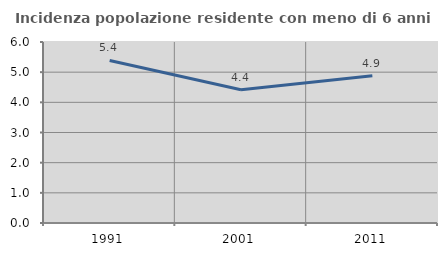
| Category | Incidenza popolazione residente con meno di 6 anni |
|---|---|
| 1991.0 | 5.388 |
| 2001.0 | 4.419 |
| 2011.0 | 4.882 |